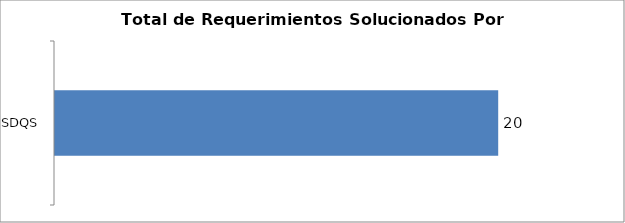
| Category | Total |
|---|---|
| SDQS | 20 |